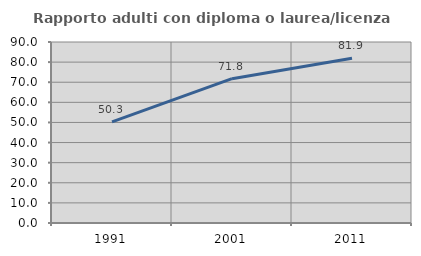
| Category | Rapporto adulti con diploma o laurea/licenza media  |
|---|---|
| 1991.0 | 50.301 |
| 2001.0 | 71.759 |
| 2011.0 | 81.927 |